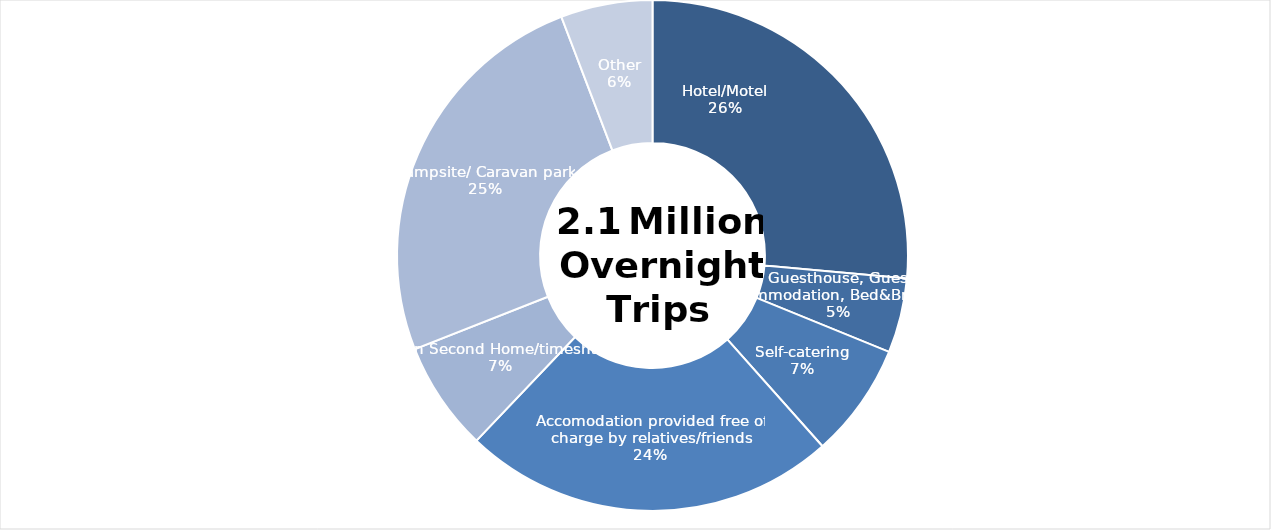
| Category | Series 0 |
|---|---|
| Hotel/Motel | 547701 |
| Guesthouse, Guest Accommodation, Bed&Breakfast | 98005 |
| Self-catering | 150402 |
| Accomodation provided free of charge by relatives/friends | 490716 |
| Own Second Home/timeshare | 143575 |
| Campsite/ Caravan park | 521532 |
| Other | 120270 |